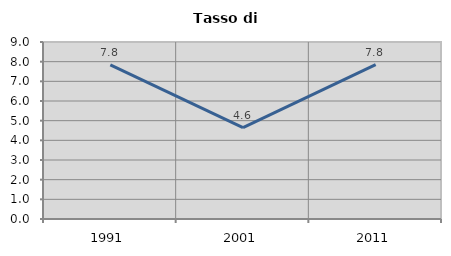
| Category | Tasso di disoccupazione   |
|---|---|
| 1991.0 | 7.835 |
| 2001.0 | 4.643 |
| 2011.0 | 7.847 |